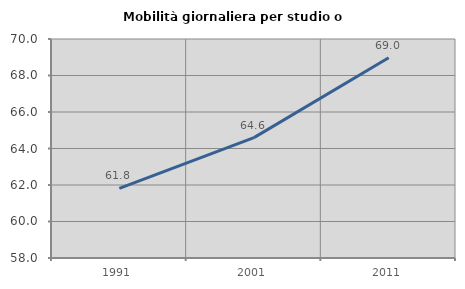
| Category | Mobilità giornaliera per studio o lavoro |
|---|---|
| 1991.0 | 61.816 |
| 2001.0 | 64.597 |
| 2011.0 | 68.972 |